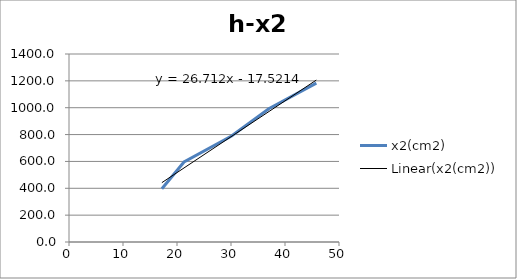
| Category | x2(cm2) |
|---|---|
| 17.2 | 396.01 |
| 21.3 | 595.36 |
| 30.1 | 789.61 |
| 37.0 | 992.25 |
| 45.8 | 1183.36 |